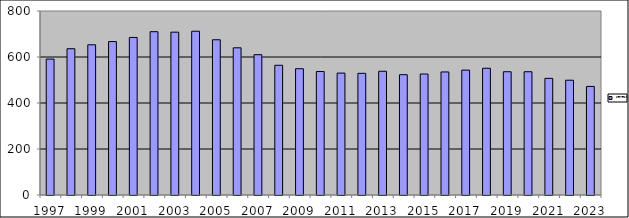
| Category | Series 0 |
|---|---|
| 1997.0 | 591 |
| 1998.0 | 636 |
| 1999.0 | 653 |
| 2000.0 | 667 |
| 2001.0 | 685 |
| 2002.0 | 710 |
| 2003.0 | 708 |
| 2004.0 | 712 |
| 2005.0 | 675 |
| 2006.0 | 640 |
| 2007.0 | 610 |
| 2008.0 | 564 |
| 2009.0 | 549 |
| 2010.0 | 537 |
| 2011.0 | 530 |
| 2012.0 | 529 |
| 2013.0 | 538 |
| 2014.0 | 523 |
| 2015.0 | 526 |
| 2016.0 | 535 |
| 2017.0 | 543 |
| 2018.0 | 551 |
| 2019.0 | 536 |
| 2020.0 | 536 |
| 2021.0 | 507 |
| 2022.0 | 499 |
| 2023.0 | 472 |